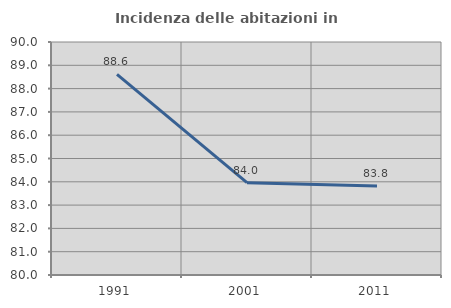
| Category | Incidenza delle abitazioni in proprietà  |
|---|---|
| 1991.0 | 88.61 |
| 2001.0 | 83.964 |
| 2011.0 | 83.824 |